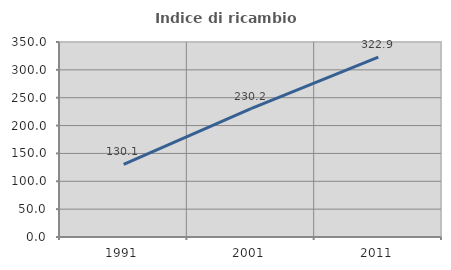
| Category | Indice di ricambio occupazionale  |
|---|---|
| 1991.0 | 130.137 |
| 2001.0 | 230.233 |
| 2011.0 | 322.857 |